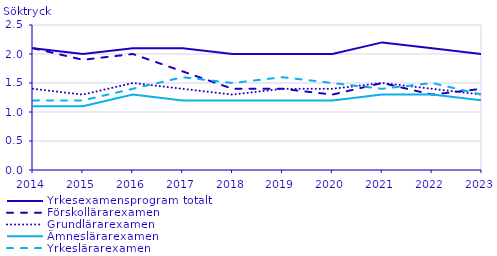
| Category | Yrkesexamensprogram totalt | Förskollärarexamen                                 | Grundlärarexamen                                   | Ämneslärarexamen                                   | Yrkeslärarexamen                                   |
|---|---|---|---|---|---|
| 2014.0 | 2.1 | 2.1 | 1.4 | 1.1 | 1.2 |
| 2015.0 | 2 | 1.9 | 1.3 | 1.1 | 1.2 |
| 2016.0 | 2.1 | 2 | 1.5 | 1.3 | 1.4 |
| 2017.0 | 2.1 | 1.7 | 1.4 | 1.2 | 1.6 |
| 2018.0 | 2 | 1.4 | 1.3 | 1.2 | 1.5 |
| 2019.0 | 2 | 1.4 | 1.4 | 1.2 | 1.6 |
| 2020.0 | 2 | 1.3 | 1.4 | 1.2 | 1.5 |
| 2021.0 | 2.2 | 1.5 | 1.5 | 1.3 | 1.4 |
| 2022.0 | 2.1 | 1.3 | 1.4 | 1.3 | 1.5 |
| 2023.0 | 2 | 1.4 | 1.3 | 1.2 | 1.3 |